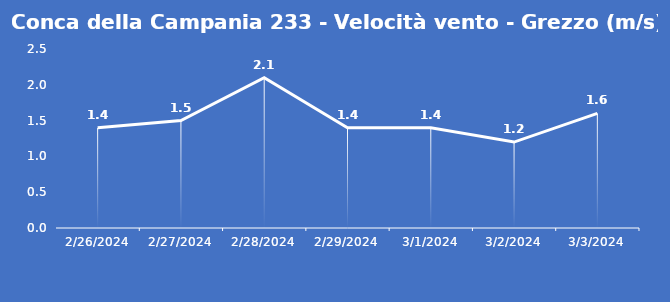
| Category | Conca della Campania 233 - Velocità vento - Grezzo (m/s) |
|---|---|
| 2/26/24 | 1.4 |
| 2/27/24 | 1.5 |
| 2/28/24 | 2.1 |
| 2/29/24 | 1.4 |
| 3/1/24 | 1.4 |
| 3/2/24 | 1.2 |
| 3/3/24 | 1.6 |